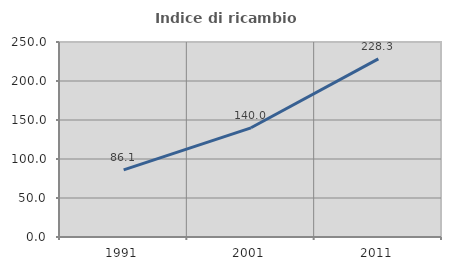
| Category | Indice di ricambio occupazionale  |
|---|---|
| 1991.0 | 86.061 |
| 2001.0 | 140 |
| 2011.0 | 228.346 |